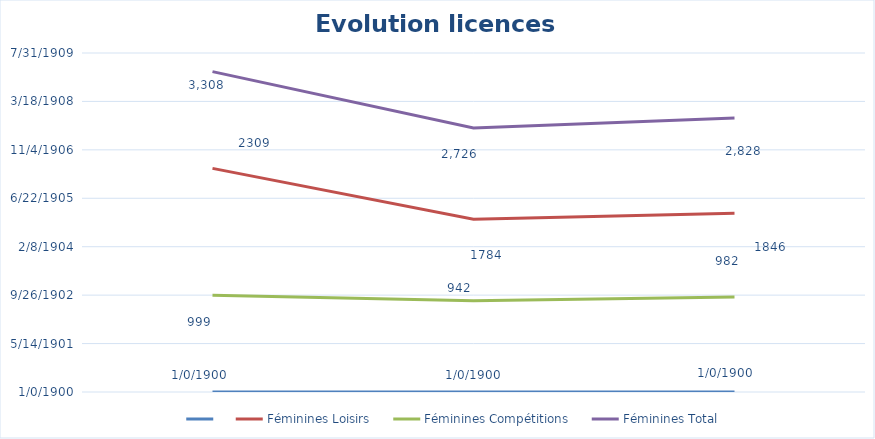
| Category | Series 0 | Féminines Loisirs | Féminines Compétitions | Féminines Total |
|---|---|---|---|---|
| 0 | 0 | 2309 | 999 | 3308 |
| 1 | 0 | 1784 | 942 | 2726 |
| 2 | 0 | 1846 | 982 | 2828 |